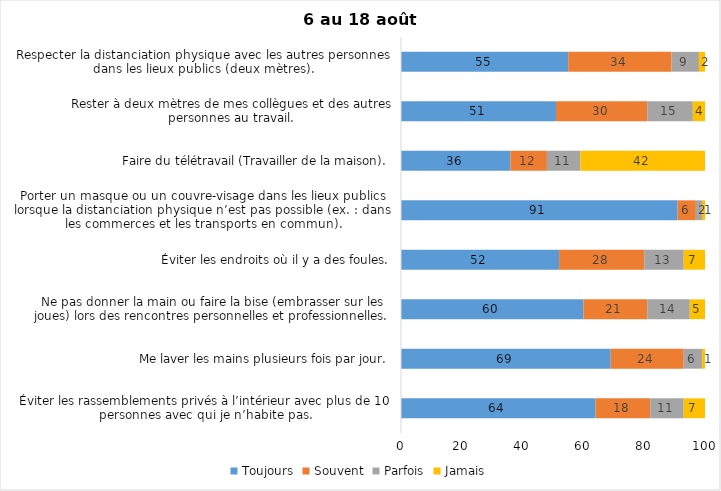
| Category | Toujours | Souvent | Parfois | Jamais |
|---|---|---|---|---|
| Éviter les rassemblements privés à l’intérieur avec plus de 10 personnes avec qui je n’habite pas. | 64 | 18 | 11 | 7 |
| Me laver les mains plusieurs fois par jour. | 69 | 24 | 6 | 1 |
| Ne pas donner la main ou faire la bise (embrasser sur les joues) lors des rencontres personnelles et professionnelles. | 60 | 21 | 14 | 5 |
| Éviter les endroits où il y a des foules. | 52 | 28 | 13 | 7 |
| Porter un masque ou un couvre-visage dans les lieux publics lorsque la distanciation physique n’est pas possible (ex. : dans les commerces et les transports en commun). | 91 | 6 | 2 | 1 |
| Faire du télétravail (Travailler de la maison). | 36 | 12 | 11 | 42 |
| Rester à deux mètres de mes collègues et des autres personnes au travail. | 51 | 30 | 15 | 4 |
| Respecter la distanciation physique avec les autres personnes dans les lieux publics (deux mètres). | 55 | 34 | 9 | 2 |